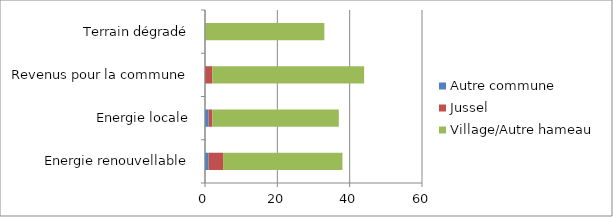
| Category | Autre commune | Jussel | Village/Autre hameau |
|---|---|---|---|
| Energie renouvellable | 1 | 4 | 33 |
| Energie locale | 1 | 1 | 35 |
| Revenus pour la commune | 0 | 2 | 42 |
| Terrain dégradé | 0 | 0 | 33 |